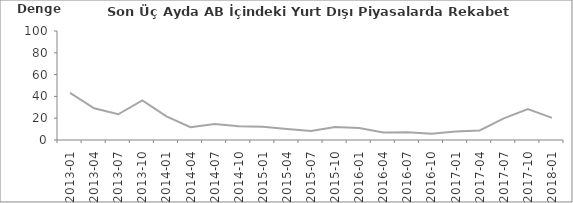
| Category | Son Üç Aydaki AB İçindeki Piyasalarda Rekabet Gücü |
|---|---|
| 2013-01 | 43.2 |
| 2013-04 | 29.1 |
| 2013-07 | 23.6 |
| 2013-10 | 36.3 |
| 2014-01 | 21.7 |
| 2014-04 | 11.8 |
| 2014-07 | 14.7 |
| 2014-10 | 12.6 |
| 2015-01 | 12.1 |
| 2015-04 | 10.1 |
| 2015-07 | 8.3 |
| 2015-10 | 11.9 |
| 2016-01 | 10.9 |
| 2016-04 | 6.8 |
| 2016-07 | 7 |
| 2016-10 | 5.8 |
| 2017-01 | 7.8 |
| 2017-04 | 8.8 |
| 2017-07 | 19.8 |
| 2017-10 | 28.4 |
| 2018-01 | 20.3 |